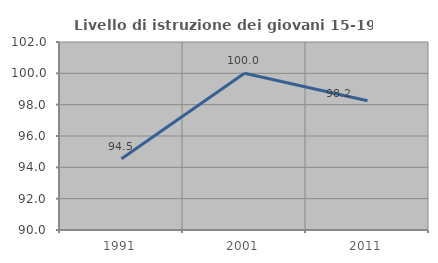
| Category | Livello di istruzione dei giovani 15-19 anni |
|---|---|
| 1991.0 | 94.545 |
| 2001.0 | 100 |
| 2011.0 | 98.246 |